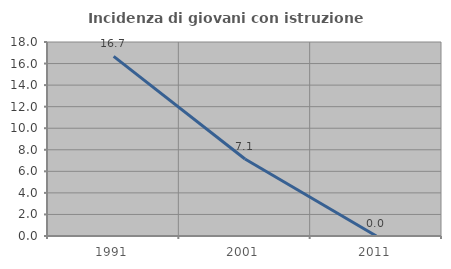
| Category | Incidenza di giovani con istruzione universitaria |
|---|---|
| 1991.0 | 16.667 |
| 2001.0 | 7.143 |
| 2011.0 | 0 |